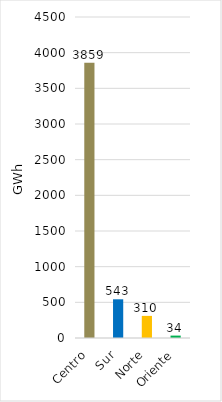
| Category | Series 0 |
|---|---|
| Centro | 3858.628 |
| Sur | 542.565 |
| Norte | 309.943 |
| Oriente | 33.738 |